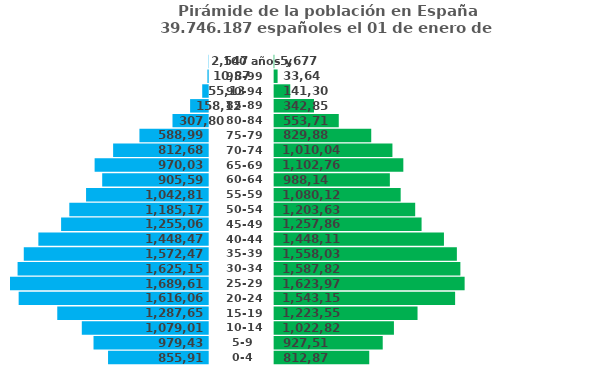
| Category | Izquierda | Hombres | Centro | Mujeres | Derecha |
|---|---|---|---|---|---|
| 0-4 años | 833706 | 855913 | 552266 | 812872 | 811105 |
| 5-9 años | 710180 | 979439 | 552266 | 927511 | 696466 |
| 10-14 años | 610607 | 1079012 | 552266 | 1022823 | 601154 |
| 15-19 años | 401964 | 1287655 | 552266 | 1223558 | 400419 |
| 20-24 años | 73554 | 1616065 | 552266 | 1543150 | 80827 |
| 25-29 años | 0 | 1689619 | 552266 | 1623977 | 0 |
| 30-34 años | 64467 | 1625152 | 552266 | 1587824 | 36153 |
| 35-39 años | 117140 | 1572479 | 552266 | 1558033 | 65944 |
| 40-44 años | 241141 | 1448478 | 552266 | 1448115 | 175862 |
| 45-49 años | 434553 | 1255066 | 552266 | 1257865 | 366112 |
| 50-54 años | 504440 | 1185179 | 552266 | 1203632 | 420345 |
| 55-59 años | 646802 | 1042817 | 552266 | 1080122 | 543855 |
| 60-64 años | 784021 | 905598 | 552266 | 988147 | 635830 |
| 65-69 años | 719582 | 970037 | 552266 | 1102763 | 521214 |
| 70-74 años | 876931 | 812688 | 552266 | 1010045 | 613932 |
| 75-79 años | 1100627 | 588992 | 552266 | 829882 | 794095 |
| 80-84 años | 1381817 | 307802 | 552266 | 553710 | 1070267 |
| 85-89 años | 1531494 | 158125 | 552266 | 342858 | 1281119 |
| 90-94 años | 1634484 | 55135 | 552266 | 141306 | 1482671 |
| 95-99 años | 1678740 | 10879 | 552266 | 33640 | 1590337 |
| 100 años y más | 1687072 | 2547 | 552266 | 5677 | 1618300 |